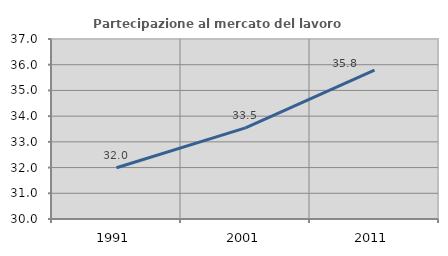
| Category | Partecipazione al mercato del lavoro  femminile |
|---|---|
| 1991.0 | 31.994 |
| 2001.0 | 33.541 |
| 2011.0 | 35.793 |